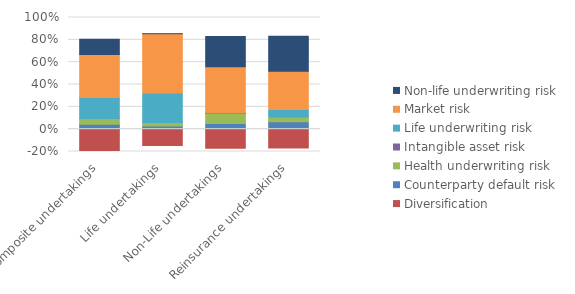
| Category | Diversification | Counterparty default risk | Health underwriting risk | Intangible asset risk | Life underwriting risk | Market risk | Non-life underwriting risk |
|---|---|---|---|---|---|---|---|
| Composite undertakings | -160421400000 | 36775011259 | 40964219433 | 58837412.11 | 155263825599 | 315715173534 | 111579923997 |
| Life undertakings | -56021918540 | 11105776153 | 11498568166 | 63385401.2 | 101672108694 | 203067623148 | 202745827.54 |
| Non-Life undertakings | -98179796512 | 28561433551 | 52475134283 | 88580300.57 | 4433692686.2 | 236330503917 | 155327479855 |
| Reinsurance undertakings | -8650098875 | 3441141108.6 | 2191899870.7 | 0 | 3437026251.4 | 17644457103 | 16252828504 |